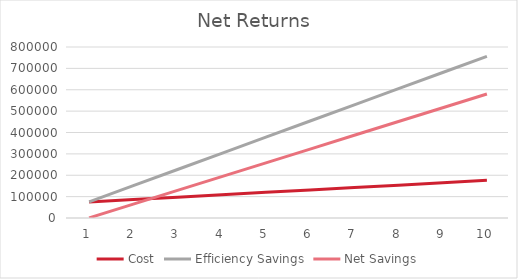
| Category | Cost | Efficiency Savings | Net Savings |
|---|---|---|---|
| 1.0 | 75000 | 75625 | 625 |
| 2.0 | 86250 | 151250 | 65000 |
| 3.0 | 97500 | 226875 | 129375 |
| 4.0 | 108750 | 302500 | 193750 |
| 5.0 | 120000 | 378125 | 258125 |
| 6.0 | 131250 | 453750 | 322500 |
| 7.0 | 142500 | 529375 | 386875 |
| 8.0 | 153750 | 605000 | 451250 |
| 9.0 | 165000 | 680625 | 515625 |
| 10.0 | 176250 | 756250 | 580000 |